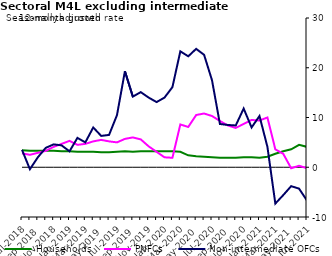
| Category | zero | Households | PNFCs | Non-intermediate OFCs |
|---|---|---|---|---|
| Mar-2018 | 0 | 3.4 | 2.7 | 5.7 |
| Apr-2018 | 0 | 3.5 | 2.5 | 1.8 |
| May-2018 | 0 | 3.5 | 2 | -0.6 |
| Jun-2018 | 0 | 3.5 | 2.5 | 1.8 |
| Jul-2018 | 0 | 3.4 | 2.7 | 3.5 |
| Aug-2018 | 0 | 3.3 | 2.5 | -0.4 |
| Sep-2018 | 0 | 3.3 | 2.9 | 2 |
| Oct-2018 | 0 | 3.3 | 3.3 | 3.9 |
| Nov-2018 | 0 | 3.3 | 4.1 | 4.6 |
| Dec-2018 | 0 | 3.2 | 4.8 | 4.4 |
| Jan-2019 | 0 | 3.2 | 5.3 | 3.2 |
| Feb-2019 | 0 | 3.1 | 4.5 | 5.9 |
| Mar-2019 | 0 | 3.1 | 4.7 | 5 |
| Apr-2019 | 0 | 3.1 | 5.2 | 8 |
| May-2019 | 0 | 3 | 5.4 | 6.3 |
| Jun-2019 | 0 | 3 | 5.3 | 6.5 |
| Jul-2019 | 0 | 3.1 | 5.1 | 10.5 |
| Aug-2019 | 0 | 3.2 | 5.7 | 19.3 |
| Sep-2019 | 0 | 3.1 | 6 | 14.2 |
| Oct-2019 | 0 | 3.2 | 5.5 | 15.1 |
| Nov-2019 | 0 | 3.2 | 4.2 | 14 |
| Dec-2019 | 0 | 3.2 | 3.1 | 13.1 |
| Jan-2020 | 0 | 3.2 | 2 | 14 |
| Feb-2020 | 0 | 3.2 | 1.9 | 16.1 |
| Mar-2020 | 0 | 3.1 | 8.6 | 23.3 |
| Apr-2020 | 0 | 2.4 | 8 | 22.3 |
| May-2020 | 0 | 2.2 | 10.4 | 23.8 |
| Jun-2020 | 0 | 2.1 | 10.8 | 22.6 |
| Jul-2020 | 0 | 2 | 10.2 | 17.5 |
| Aug-2020 | 0 | 1.9 | 9.3 | 8.7 |
| Sep-2020 | 0 | 1.9 | 8.5 | 8.5 |
| Oct-2020 | 0 | 1.9 | 7.9 | 8.4 |
| Nov-2020 | 0 | 2 | 8.7 | 11.8 |
| Dec-2020 | 0 | 2 | 9.5 | 8 |
| Jan-2021 | 0 | 1.9 | 9.3 | 10.3 |
| Feb-2021 | 0 | 2.1 | 10 | 4.1 |
| Mar-2021 | 0 | 2.7 | 3.6 | -7.3 |